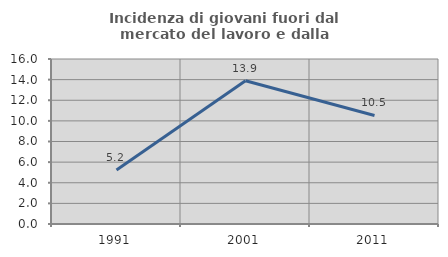
| Category | Incidenza di giovani fuori dal mercato del lavoro e dalla formazione  |
|---|---|
| 1991.0 | 5.236 |
| 2001.0 | 13.889 |
| 2011.0 | 10.526 |